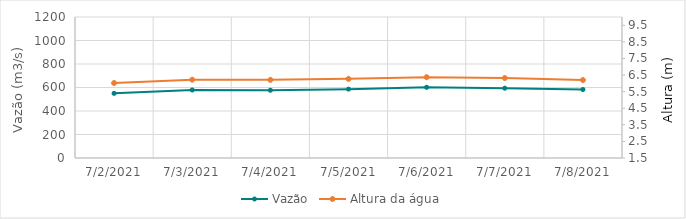
| Category | Vazão |
|---|---|
| 6/6/21 | 723.29 |
| 6/5/21 | 742.76 |
| 6/4/21 | 786.92 |
| 6/3/21 | 815.66 |
| 6/2/21 | 837.87 |
| 6/1/21 | 846.58 |
| 5/31/21 | 835.99 |